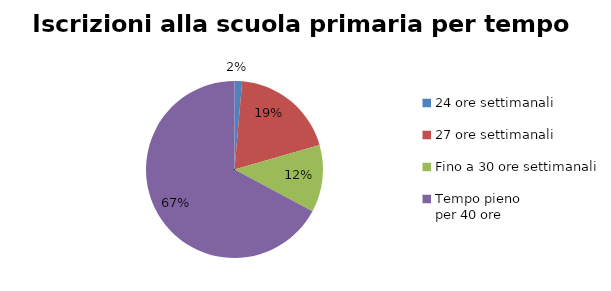
| Category | Series 1 | Series 0 |
|---|---|---|
| 24 ore settimanali | 807 | 807 |
| 27 ore settimanali | 11182 | 11182 |
| Fino a 30 ore settimanali | 7167 | 7167 |
| Tempo pieno 
per 40 ore | 39174 | 39174 |